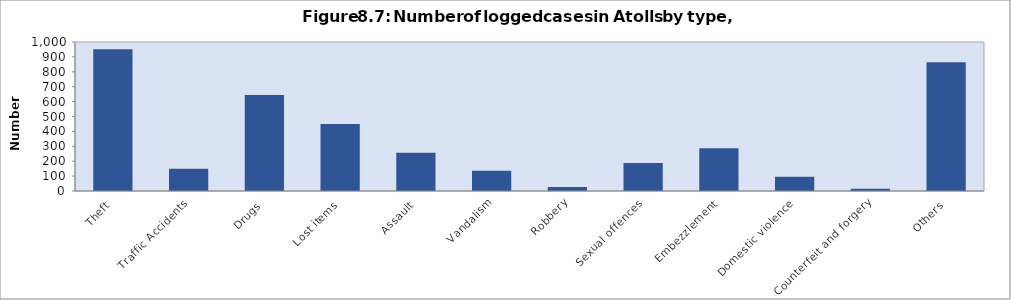
| Category | Series 0 |
|---|---|
| Theft | 952 |
| Traffic Accidents | 149 |
| Drugs | 645 |
| Lost items | 450 |
| Assault | 256 |
| Vandalism | 136 |
| Robbery | 27 |
| Sexual offences | 188 |
| Embezzlement | 287 |
| Domestic violence | 96 |
| Counterfeit and forgery | 15 |
| Others | 864 |